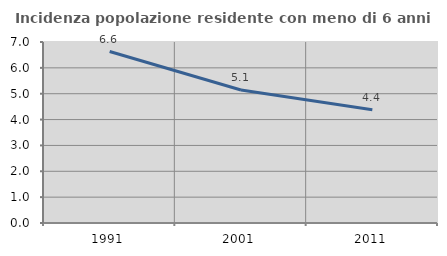
| Category | Incidenza popolazione residente con meno di 6 anni |
|---|---|
| 1991.0 | 6.632 |
| 2001.0 | 5.142 |
| 2011.0 | 4.377 |